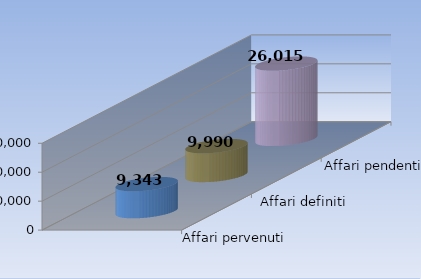
| Category | Affari pervenuti | Affari definiti | Affari pendenti |
|---|---|---|---|
| 0 | 9343 | 9990 | 26015 |